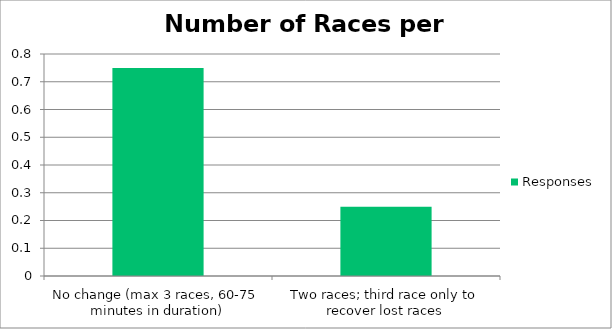
| Category | Responses |
|---|---|
| 2No change (max 3 races, 60-75 minutes in duration) | 0.75 |
| 0Two races; third race only to recover lost races | 0.25 |